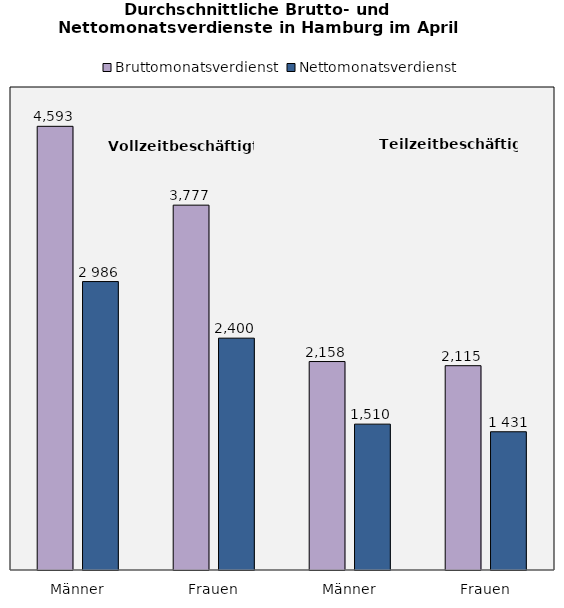
| Category | Bruttomonatsverdienst | Nettomonatsverdienst |
|---|---|---|
| Männer | 4593 | 2986 |
| Frauen | 3777 | 2400 |
| Männer | 2158 | 1510 |
| Frauen | 2115 | 1431 |